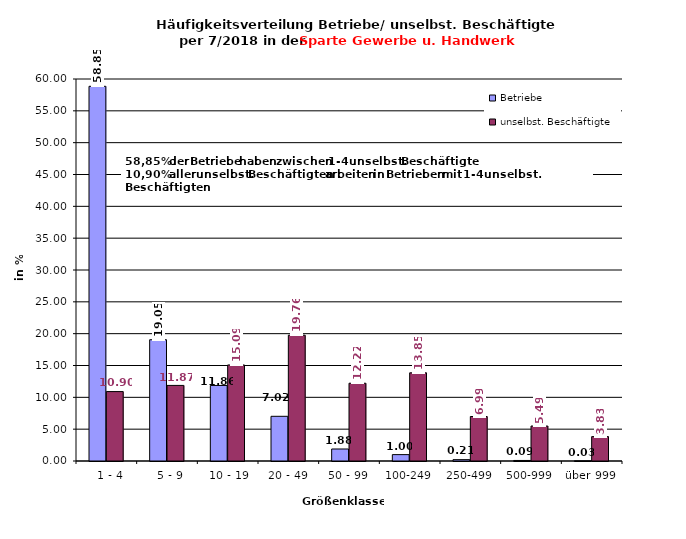
| Category | Betriebe | unselbst. Beschäftigte |
|---|---|---|
|   1 - 4 | 58.852 | 10.904 |
|   5 - 9 | 19.048 | 11.871 |
|  10 - 19 | 11.864 | 15.086 |
| 20 - 49 | 7.02 | 19.761 |
| 50 - 99 | 1.885 | 12.216 |
| 100-249 | 1.003 | 13.851 |
| 250-499 | 0.213 | 6.989 |
| 500-999 | 0.085 | 5.493 |
| über 999 | 0.028 | 3.831 |